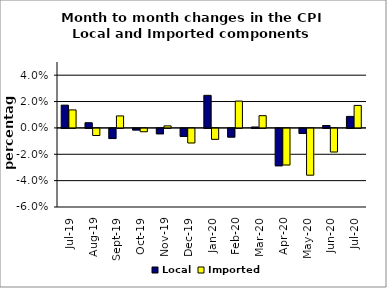
| Category | Local | Imported |
|---|---|---|
| 2019-07-01 | 0.017 | 0.014 |
| 2019-08-01 | 0.004 | -0.005 |
| 2019-09-01 | -0.008 | 0.009 |
| 2019-10-01 | -0.001 | -0.003 |
| 2019-11-01 | -0.004 | 0.002 |
| 2019-12-01 | -0.006 | -0.011 |
| 2020-01-01 | 0.025 | -0.008 |
| 2020-02-01 | -0.007 | 0.02 |
| 2020-03-01 | 0.001 | 0.009 |
| 2020-04-01 | -0.028 | -0.028 |
| 2020-05-01 | -0.004 | -0.035 |
| 2020-06-01 | 0.002 | -0.018 |
| 2020-07-01 | 0.009 | 0.017 |